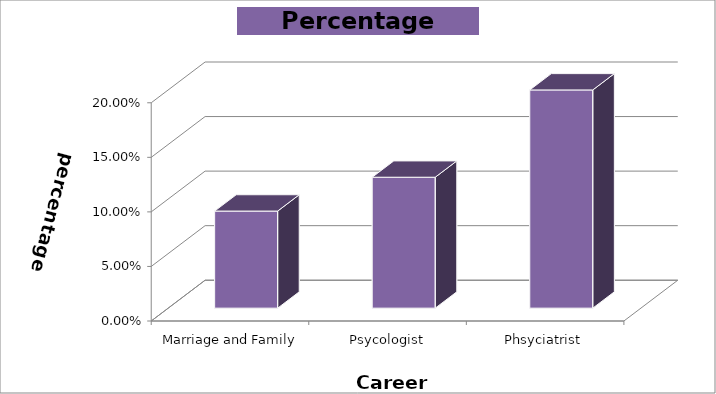
| Category | Series 0 |
|---|---|
| Marriage and Family Therapist | 0.089 |
| Psycologist | 0.12 |
| Phsyciatrist | 0.2 |